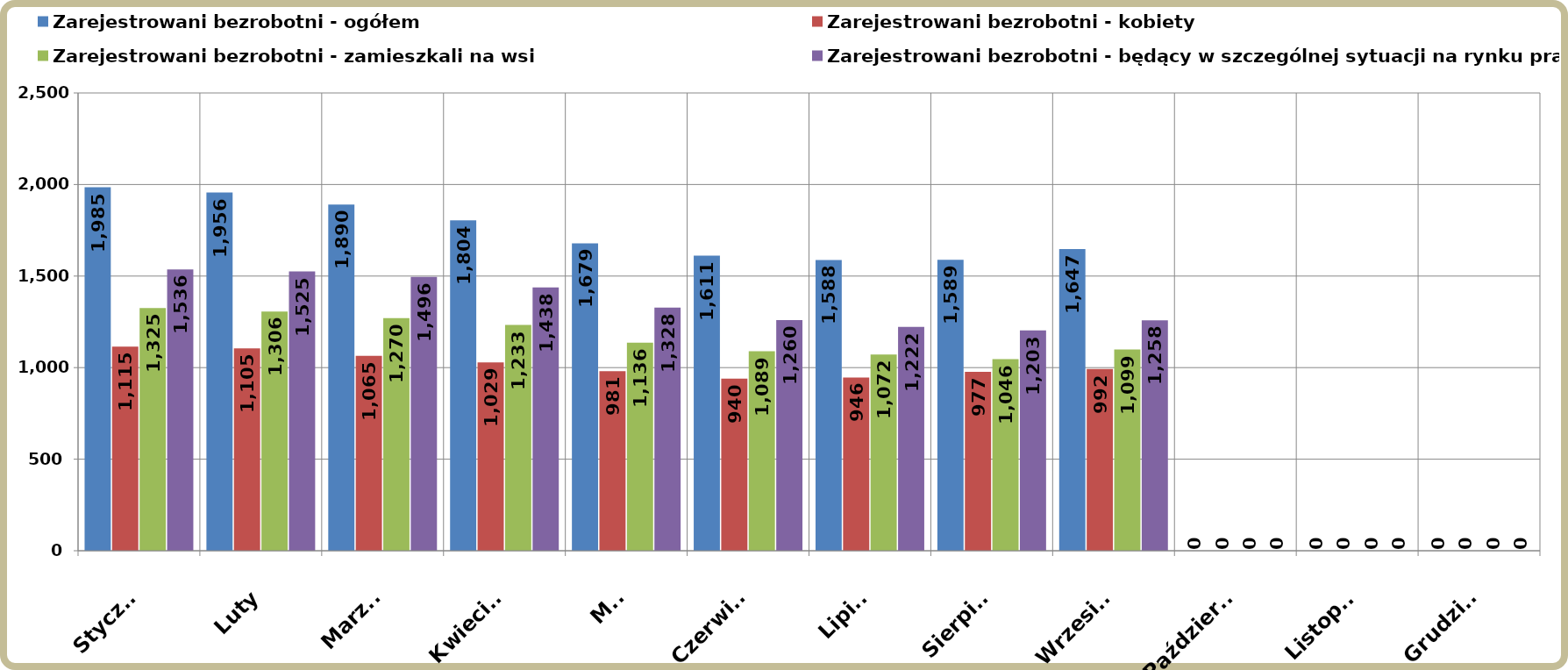
| Category | Zarejestrowani bezrobotni - ogółem | Zarejestrowani bezrobotni - kobiety | Zarejestrowani bezrobotni - zamieszkali na wsi | Zarejestrowani bezrobotni - będący w szczególnej sytuacji na rynku pracy |
|---|---|---|---|---|
| Styczeń | 1985 | 1115 | 1325 | 1536 |
| Luty | 1956 | 1105 | 1306 | 1525 |
| Marzec | 1890 | 1065 | 1270 | 1496 |
| Kwiecień | 1804 | 1029 | 1233 | 1438 |
| Maj | 1679 | 981 | 1136 | 1328 |
| Czerwiec | 1611 | 940 | 1089 | 1260 |
| Lipiec | 1588 | 946 | 1072 | 1222 |
| Sierpień | 1589 | 977 | 1046 | 1203 |
| Wrzesień | 1647 | 992 | 1099 | 1258 |
| Październik | 0 | 0 | 0 | 0 |
| Listopad | 0 | 0 | 0 | 0 |
| Grudzień | 0 | 0 | 0 | 0 |